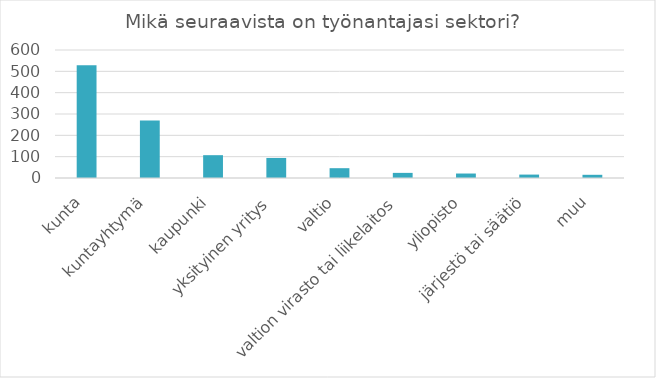
| Category | Summa |
|---|---|
| kunta, kuntayhtymä, kaupunki | 528 |
| yksityinen yritys | 269 |
| valtio, valtion virasto tai liikelaitos | 107 |
| yliopisto | 94 |
| järjestö tai säätiö | 46 |
| muu | 24 |
| seurakunta, seurakuntayhtymä | 21 |
| teen toimeksiantoja tai keikkatöitä | 16 |
| oma yritys | 15 |